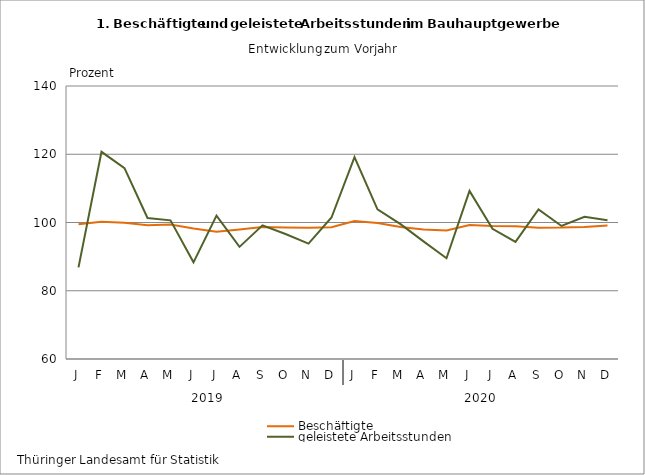
| Category | Beschäftigte | geleistete Arbeitsstunden |
|---|---|---|
| J | 99.489 | 86.864 |
| F | 100.237 | 120.71 |
| M | 99.918 | 115.95 |
| A | 99.218 | 101.318 |
| M | 99.401 | 100.626 |
| J | 98.256 | 88.324 |
| J | 97.316 | 102 |
| A | 97.933 | 92.858 |
| S | 98.689 | 99.157 |
| O | 98.527 | 96.624 |
| N | 98.491 | 93.81 |
| D | 98.625 | 101.47 |
| J | 100.409 | 119.151 |
| F | 99.868 | 103.832 |
| M | 98.676 | 99.505 |
| A | 97.976 | 94.468 |
| M | 97.664 | 89.538 |
| J | 99.276 | 109.247 |
| J | 98.996 | 98.152 |
| A | 98.908 | 94.324 |
| S | 98.449 | 103.811 |
| O | 98.499 | 98.979 |
| N | 98.7 | 101.654 |
| D | 99.116 | 100.628 |